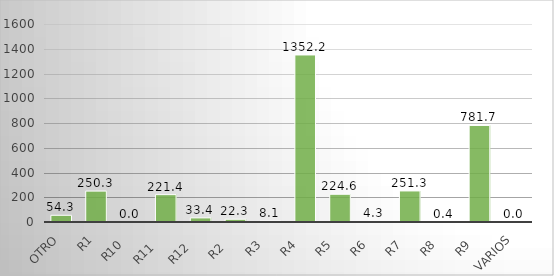
| Category | Series 0 |
|---|---|
| Otro | 54.279 |
| R1 | 250.319 |
| R10   | 0 |
| R11    | 221.403 |
| R12    | 33.39 |
| R2    | 22.309 |
| R3   | 8.114 |
| R4   | 1352.178 |
| R5   | 224.566 |
| R6   | 4.271 |
| R7   | 251.337 |
| R8   | 0.366 |
| R9   | 781.662 |
| Varios | 0.049 |